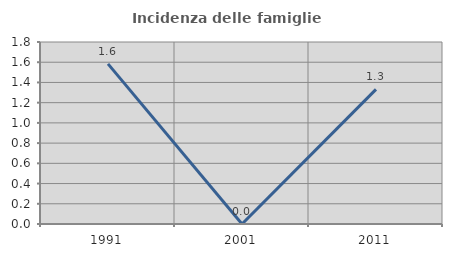
| Category | Incidenza delle famiglie numerose |
|---|---|
| 1991.0 | 1.584 |
| 2001.0 | 0 |
| 2011.0 | 1.331 |